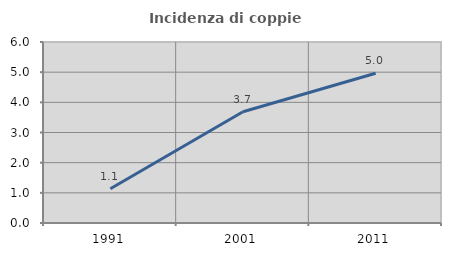
| Category | Incidenza di coppie miste |
|---|---|
| 1991.0 | 1.133 |
| 2001.0 | 3.687 |
| 2011.0 | 4.965 |